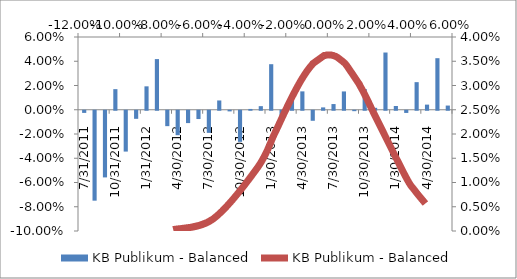
| Category | KB Publikum - Balanced |
|---|---|
| 31/07/2011 | -0.002 |
| 31/08/2011 | -0.074 |
| 30/09/2011 | -0.055 |
| 31/10/2011 | 0.017 |
| 30/11/2011 | -0.034 |
| 31/12/2011 | -0.007 |
| 31/01/2012 | 0.019 |
| 29/02/2012 | 0.042 |
| 31/03/2012 | -0.013 |
| 30/04/2012 | -0.02 |
| 31/05/2012 | -0.01 |
| 30/06/2012 | -0.007 |
| 31/07/2012 | -0.018 |
| 31/08/2012 | 0.008 |
| 30/09/2012 | -0.001 |
| 31/10/2012 | -0.026 |
| 30/11/2012 | 0.001 |
| 31/12/2012 | 0.003 |
| 31/01/2013 | 0.038 |
| 28/02/2013 | -0.009 |
| 31/03/2013 | 0.008 |
| 30/04/2013 | 0.015 |
| 31/05/2013 | -0.008 |
| 30/06/2013 | 0.002 |
| 31/07/2013 | 0.005 |
| 31/08/2013 | 0.015 |
| 30/09/2013 | 0 |
| 31/10/2013 | 0.017 |
| 30/11/2013 | 0.002 |
| 31/12/2013 | 0.047 |
| 31/01/2014 | 0.003 |
| 28/02/2014 | -0.002 |
| 31/03/2014 | 0.023 |
| 30/04/2014 | 0.004 |
| 31/05/2014 | 0.043 |
| 30/06/2014 | 0.003 |